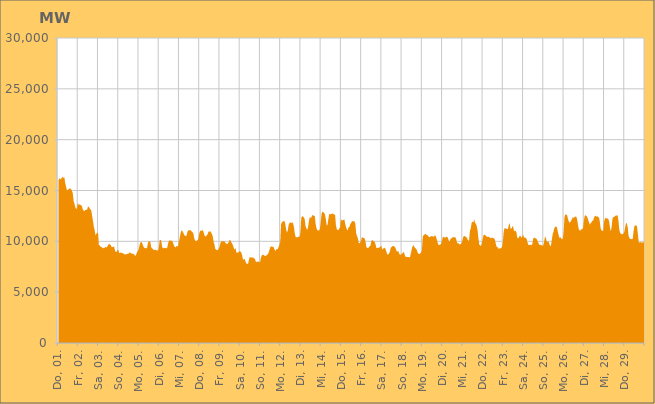
| Category | Series 0 |
|---|---|
|  Do, 01.  | 15973.024 |
|  Do, 01.  | 16181.244 |
|  Do, 01.  | 16151.253 |
|  Do, 01.  | 16112.939 |
|  Do, 01.  | 16266.176 |
|  Do, 01.  | 16353.806 |
|  Do, 01.  | 16229.027 |
|  Do, 01.  | 16307.304 |
|  Do, 01.  | 15726.67 |
|  Do, 01.  | 15411.526 |
|  Do, 01.  | 15055.984 |
|  Do, 01.  | 15001.579 |
|  Do, 01.  | 15139.679 |
|  Do, 01.  | 15179.922 |
|  Do, 01.  | 15215.665 |
|  Do, 01.  | 15140.846 |
|  Do, 01.  | 14971.231 |
|  Fr, 02.  | 14739.863 |
|  Fr, 02.  | 13972.299 |
|  Fr, 02.  | 13689.066 |
|  Fr, 02.  | 13361.912 |
|  Fr, 02.  | 13167.108 |
|  Fr, 02.  | 13268.631 |
|  Fr, 02.  | 13795.429 |
|  Fr, 02.  | 13591.06 |
|  Fr, 02.  | 13639.024 |
|  Fr, 02.  | 13594.183 |
|  Fr, 02.  | 13567.473 |
|  Fr, 02.  | 13409.868 |
|  Fr, 02.  | 13125.726 |
|  Fr, 02.  | 13001.564 |
|  Fr, 02.  | 12976.859 |
|  Fr, 02.  | 13080.528 |
|  Fr, 02.  | 13109.328 |
|  Fr, 02.  | 13105.562 |
|  Fr, 02.  | 13424.014 |
|  Fr, 02.  | 13401.077 |
|  Fr, 02.  | 13242.371 |
|  Fr, 02.  | 13151.693 |
|  Fr, 02.  | 13008.201 |
|  Fr, 02.  | 12475.806 |
|  Sa, 03.  | 12000.596 |
|  Sa, 03.  | 11430.194 |
|  Sa, 03.  | 11073.486 |
|  Sa, 03.  | 10582.131 |
|  Sa, 03.  | 10747.38 |
|  Sa, 03.  | 10856.532 |
|  Sa, 03.  | 10843.616 |
|  Sa, 03.  | 9610.03 |
|  Sa, 03.  | 9612.483 |
|  Sa, 03.  | 9476.751 |
|  Sa, 03.  | 9434.888 |
|  Sa, 03.  | 9360.974 |
|  Sa, 03.  | 9357.126 |
|  Sa, 03.  | 9306.625 |
|  Sa, 03.  | 9394.502 |
|  Sa, 03.  | 9457.1 |
|  Sa, 03.  | 9382.035 |
|  Sa, 03.  | 9501.917 |
|  Sa, 03.  | 9639.043 |
|  Sa, 03.  | 9762.879 |
|  Sa, 03.  | 9680.03 |
|  Sa, 03.  | 9643.187 |
|  Sa, 03.  | 9454.922 |
|  Sa, 03.  | 9428.805 |
|  So, 04.  | 9457.236 |
|  So, 04.  | 9495.153 |
|  So, 04.  | 9115.218 |
|  So, 04.  | 8938.82 |
|  So, 04.  | 8978.699 |
|  So, 04.  | 9135.456 |
|  So, 04.  | 9165.17 |
|  So, 04.  | 8843.097 |
|  So, 04.  | 8870.477 |
|  So, 04.  | 8892.076 |
|  So, 04.  | 8862.463 |
|  So, 04.  | 8864.319 |
|  So, 04.  | 8797.101 |
|  So, 04.  | 8730.633 |
|  So, 04.  | 8710.415 |
|  So, 04.  | 8751.233 |
|  So, 04.  | 8720.379 |
|  So, 04.  | 8785.919 |
|  So, 04.  | 8790.362 |
|  So, 04.  | 8881.627 |
|  So, 04.  | 8892.771 |
|  So, 04.  | 8824.985 |
|  So, 04.  | 8792.995 |
|  So, 04.  | 8774.985 |
|  Mo, 05.  | 8767.964 |
|  Mo, 05.  | 8681.777 |
|  Mo, 05.  | 8569.146 |
|  Mo, 05.  | 8632.191 |
|  Mo, 05.  | 8909.321 |
|  Mo, 05.  | 9032.205 |
|  Mo, 05.  | 9164.973 |
|  Mo, 05.  | 9527.968 |
|  Mo, 05.  | 9883.836 |
|  Mo, 05.  | 9926.851 |
|  Mo, 05.  | 9894.441 |
|  Mo, 05.  | 9660.539 |
|  Mo, 05.  | 9451.565 |
|  Mo, 05.  | 9369.037 |
|  Mo, 05.  | 9296.504 |
|  Mo, 05.  | 9349.753 |
|  Mo, 05.  | 9326.724 |
|  Mo, 05.  | 9764.883 |
|  Mo, 05.  | 10021.066 |
|  Mo, 05.  | 10010.311 |
|  Mo, 05.  | 9916.345 |
|  Mo, 05.  | 9427.824 |
|  Mo, 05.  | 9309.191 |
|  Mo, 05.  | 9244.052 |
|  Di, 06.  | 9142.913 |
|  Di, 06.  | 9183.791 |
|  Di, 06.  | 9181.81 |
|  Di, 06.  | 9133.861 |
|  Di, 06.  | 9094.754 |
|  Di, 06.  | 9093.314 |
|  Di, 06.  | 9355.79 |
|  Di, 06.  | 10075.642 |
|  Di, 06.  | 10158.158 |
|  Di, 06.  | 10036.177 |
|  Di, 06.  | 9459.117 |
|  Di, 06.  | 9312.2 |
|  Di, 06.  | 9324.291 |
|  Di, 06.  | 9361.728 |
|  Di, 06.  | 9343.222 |
|  Di, 06.  | 9308.455 |
|  Di, 06.  | 9367.006 |
|  Di, 06.  | 9776.653 |
|  Di, 06.  | 10054.021 |
|  Di, 06.  | 10089.498 |
|  Di, 06.  | 10068.217 |
|  Di, 06.  | 10064.181 |
|  Di, 06.  | 10060.848 |
|  Di, 06.  | 9814.581 |
|  Mi, 07.  | 9580.023 |
|  Mi, 07.  | 9466.96 |
|  Mi, 07.  | 9396.924 |
|  Mi, 07.  | 9548.819 |
|  Mi, 07.  | 9492.777 |
|  Mi, 07.  | 9540.759 |
|  Mi, 07.  | 10015.825 |
|  Mi, 07.  | 10433.23 |
|  Mi, 07.  | 10863.119 |
|  Mi, 07.  | 11075.724 |
|  Mi, 07.  | 11023.126 |
|  Mi, 07.  | 10860.678 |
|  Mi, 07.  | 10660.158 |
|  Mi, 07.  | 10536.947 |
|  Mi, 07.  | 10534.384 |
|  Mi, 07.  | 10564.515 |
|  Mi, 07.  | 10930.108 |
|  Mi, 07.  | 11082.345 |
|  Mi, 07.  | 11092.18 |
|  Mi, 07.  | 11103.236 |
|  Mi, 07.  | 11075.138 |
|  Mi, 07.  | 10965.102 |
|  Mi, 07.  | 10897.066 |
|  Mi, 07.  | 10781.215 |
|  Do, 08.  | 10314.994 |
|  Do, 08.  | 10088.684 |
|  Do, 08.  | 10023.937 |
|  Do, 08.  | 10042.881 |
|  Do, 08.  | 10115.078 |
|  Do, 08.  | 10249.32 |
|  Do, 08.  | 10787.255 |
|  Do, 08.  | 11009.731 |
|  Do, 08.  | 11061.217 |
|  Do, 08.  | 11023.871 |
|  Do, 08.  | 11116.862 |
|  Do, 08.  | 10955.682 |
|  Do, 08.  | 10633.098 |
|  Do, 08.  | 10464.734 |
|  Do, 08.  | 10517.703 |
|  Do, 08.  | 10597.197 |
|  Do, 08.  | 10716.789 |
|  Do, 08.  | 10979.657 |
|  Do, 08.  | 10956.759 |
|  Do, 08.  | 10995.235 |
|  Do, 08.  | 10868.739 |
|  Do, 08.  | 10702.028 |
|  Do, 08.  | 10491.965 |
|  Do, 08.  | 9958.967 |
|  Fr, 09.  | 9689.092 |
|  Fr, 09.  | 9230.106 |
|  Fr, 09.  | 9205.088 |
|  Fr, 09.  | 9124.329 |
|  Fr, 09.  | 9153.877 |
|  Fr, 09.  | 9268.685 |
|  Fr, 09.  | 9473.546 |
|  Fr, 09.  | 9814.813 |
|  Fr, 09.  | 10020.173 |
|  Fr, 09.  | 9973.335 |
|  Fr, 09.  | 10024.211 |
|  Fr, 09.  | 10008.517 |
|  Fr, 09.  | 9999.473 |
|  Fr, 09.  | 9831.953 |
|  Fr, 09.  | 9783.682 |
|  Fr, 09.  | 9718.68 |
|  Fr, 09.  | 9811.833 |
|  Fr, 09.  | 9927.707 |
|  Fr, 09.  | 10144.272 |
|  Fr, 09.  | 10089.063 |
|  Fr, 09.  | 9892.266 |
|  Fr, 09.  | 9777.616 |
|  Fr, 09.  | 9575.658 |
|  Fr, 09.  | 9330.206 |
|  Sa, 10.  | 9176.049 |
|  Sa, 10.  | 9342.849 |
|  Sa, 10.  | 8905.164 |
|  Sa, 10.  | 8883.748 |
|  Sa, 10.  | 8898.603 |
|  Sa, 10.  | 8945.141 |
|  Sa, 10.  | 9072.009 |
|  Sa, 10.  | 8986.767 |
|  Sa, 10.  | 8860.562 |
|  Sa, 10.  | 8565.263 |
|  Sa, 10.  | 8151.544 |
|  Sa, 10.  | 8301.929 |
|  Sa, 10.  | 8218.749 |
|  Sa, 10.  | 7970.765 |
|  Sa, 10.  | 7798.356 |
|  Sa, 10.  | 7778.507 |
|  Sa, 10.  | 7816.417 |
|  Sa, 10.  | 8251.659 |
|  Sa, 10.  | 8480.732 |
|  Sa, 10.  | 8398.217 |
|  Sa, 10.  | 8403.713 |
|  Sa, 10.  | 8401.515 |
|  Sa, 10.  | 8406.379 |
|  Sa, 10.  | 8320.421 |
|  So, 11.  | 8273.512 |
|  So, 11.  | 8004.156 |
|  So, 11.  | 7954.755 |
|  So, 11.  | 8014.545 |
|  So, 11.  | 8008.324 |
|  So, 11.  | 7970.659 |
|  So, 11.  | 7903.126 |
|  So, 11.  | 8350.441 |
|  So, 11.  | 8604.19 |
|  So, 11.  | 8676.769 |
|  So, 11.  | 8677.67 |
|  So, 11.  | 8599.654 |
|  So, 11.  | 8581.068 |
|  So, 11.  | 8557.444 |
|  So, 11.  | 8644.376 |
|  So, 11.  | 8713.016 |
|  So, 11.  | 8845.236 |
|  So, 11.  | 9102.453 |
|  So, 11.  | 9382.582 |
|  So, 11.  | 9512.894 |
|  So, 11.  | 9476.768 |
|  So, 11.  | 9459.488 |
|  So, 11.  | 9455.46 |
|  So, 11.  | 9262.176 |
|  Mo, 12.  | 9030.014 |
|  Mo, 12.  | 9159.121 |
|  Mo, 12.  | 9266.093 |
|  Mo, 12.  | 9220.098 |
|  Mo, 12.  | 9427.814 |
|  Mo, 12.  | 9652.057 |
|  Mo, 12.  | 9911.663 |
|  Mo, 12.  | 11668.728 |
|  Mo, 12.  | 11894.321 |
|  Mo, 12.  | 11942.183 |
|  Mo, 12.  | 11987.23 |
|  Mo, 12.  | 12023.788 |
|  Mo, 12.  | 11706.176 |
|  Mo, 12.  | 11168.44 |
|  Mo, 12.  | 10857.049 |
|  Mo, 12.  | 11079.002 |
|  Mo, 12.  | 11638.923 |
|  Mo, 12.  | 11813.154 |
|  Mo, 12.  | 11873.482 |
|  Mo, 12.  | 11774.899 |
|  Mo, 12.  | 11886.039 |
|  Mo, 12.  | 11810.452 |
|  Mo, 12.  | 11515.705 |
|  Mo, 12.  | 10919.132 |
|  Di, 13.  | 10469.542 |
|  Di, 13.  | 10403.993 |
|  Di, 13.  | 10376.415 |
|  Di, 13.  | 10423.491 |
|  Di, 13.  | 10469.572 |
|  Di, 13.  | 10446.579 |
|  Di, 13.  | 10890.596 |
|  Di, 13.  | 12330.932 |
|  Di, 13.  | 12457.253 |
|  Di, 13.  | 12457.689 |
|  Di, 13.  | 12337.197 |
|  Di, 13.  | 12171.311 |
|  Di, 13.  | 11473.841 |
|  Di, 13.  | 11292.293 |
|  Di, 13.  | 11116.578 |
|  Di, 13.  | 11393.908 |
|  Di, 13.  | 11974.636 |
|  Di, 13.  | 12364.924 |
|  Di, 13.  | 12323.623 |
|  Di, 13.  | 12338.389 |
|  Di, 13.  | 12610.248 |
|  Di, 13.  | 12528.577 |
|  Di, 13.  | 12531.767 |
|  Di, 13.  | 12467.813 |
|  Mi, 14.  | 11683.941 |
|  Mi, 14.  | 11279.728 |
|  Mi, 14.  | 11104.703 |
|  Mi, 14.  | 11054.159 |
|  Mi, 14.  | 11054.23 |
|  Mi, 14.  | 11220.415 |
|  Mi, 14.  | 11824.108 |
|  Mi, 14.  | 12694.798 |
|  Mi, 14.  | 12929.112 |
|  Mi, 14.  | 12883.93 |
|  Mi, 14.  | 12799.453 |
|  Mi, 14.  | 12647.461 |
|  Mi, 14.  | 12229.811 |
|  Mi, 14.  | 11587.991 |
|  Mi, 14.  | 11568.27 |
|  Mi, 14.  | 12146.696 |
|  Mi, 14.  | 12688.925 |
|  Mi, 14.  | 12648.613 |
|  Mi, 14.  | 12667.685 |
|  Mi, 14.  | 12698.082 |
|  Mi, 14.  | 12752.541 |
|  Mi, 14.  | 12691.413 |
|  Mi, 14.  | 12585.264 |
|  Mi, 14.  | 12675.773 |
|  Do, 15.  | 11610.48 |
|  Do, 15.  | 11213.917 |
|  Do, 15.  | 11109.108 |
|  Do, 15.  | 11107.578 |
|  Do, 15.  | 11250.657 |
|  Do, 15.  | 11399.511 |
|  Do, 15.  | 12183.882 |
|  Do, 15.  | 12043.481 |
|  Do, 15.  | 12061.752 |
|  Do, 15.  | 12109.594 |
|  Do, 15.  | 12174.901 |
|  Do, 15.  | 11734.718 |
|  Do, 15.  | 11414.8 |
|  Do, 15.  | 11163.501 |
|  Do, 15.  | 11089.163 |
|  Do, 15.  | 11376.942 |
|  Do, 15.  | 11413.669 |
|  Do, 15.  | 11698.868 |
|  Do, 15.  | 11794.451 |
|  Do, 15.  | 11977.651 |
|  Do, 15.  | 11989.48 |
|  Do, 15.  | 11983.626 |
|  Do, 15.  | 11960.04 |
|  Do, 15.  | 11762.329 |
|  Fr, 16.  | 10817.773 |
|  Fr, 16.  | 10519.803 |
|  Fr, 16.  | 10318.989 |
|  Fr, 16.  | 9855.678 |
|  Fr, 16.  | 9798.03 |
|  Fr, 16.  | 9897.362 |
|  Fr, 16.  | 10116.542 |
|  Fr, 16.  | 10440.666 |
|  Fr, 16.  | 10348.851 |
|  Fr, 16.  | 10323.621 |
|  Fr, 16.  | 10292.307 |
|  Fr, 16.  | 10055.845 |
|  Fr, 16.  | 9462.713 |
|  Fr, 16.  | 9337.773 |
|  Fr, 16.  | 9381.388 |
|  Fr, 16.  | 9371.848 |
|  Fr, 16.  | 9543.293 |
|  Fr, 16.  | 9571.315 |
|  Fr, 16.  | 10015.126 |
|  Fr, 16.  | 10131.618 |
|  Fr, 16.  | 10071.005 |
|  Fr, 16.  | 9989.889 |
|  Fr, 16.  | 9960.476 |
|  Fr, 16.  | 9699.079 |
|  Sa, 17.  | 9342.598 |
|  Sa, 17.  | 9337.947 |
|  Sa, 17.  | 9393.332 |
|  Sa, 17.  | 9351.278 |
|  Sa, 17.  | 9440.294 |
|  Sa, 17.  | 9482.627 |
|  Sa, 17.  | 9568.581 |
|  Sa, 17.  | 9159.585 |
|  Sa, 17.  | 9301.907 |
|  Sa, 17.  | 9313.529 |
|  Sa, 17.  | 9377.492 |
|  Sa, 17.  | 9203.81 |
|  Sa, 17.  | 8923.941 |
|  Sa, 17.  | 8705.231 |
|  Sa, 17.  | 8697.529 |
|  Sa, 17.  | 8818.975 |
|  Sa, 17.  | 8968.874 |
|  Sa, 17.  | 9348.742 |
|  Sa, 17.  | 9443.505 |
|  Sa, 17.  | 9526.738 |
|  Sa, 17.  | 9541.513 |
|  Sa, 17.  | 9516.994 |
|  Sa, 17.  | 9449.47 |
|  Sa, 17.  | 9272.107 |
|  So, 18.  | 9031.391 |
|  So, 18.  | 8995.266 |
|  So, 18.  | 9050.035 |
|  So, 18.  | 8798.561 |
|  So, 18.  | 8693.425 |
|  So, 18.  | 8662.762 |
|  So, 18.  | 8815.595 |
|  So, 18.  | 8807.045 |
|  So, 18.  | 8961.202 |
|  So, 18.  | 8857.295 |
|  So, 18.  | 8530.805 |
|  So, 18.  | 8474.173 |
|  So, 18.  | 8472.151 |
|  So, 18.  | 8455.039 |
|  So, 18.  | 8461.75 |
|  So, 18.  | 8418.966 |
|  So, 18.  | 8479.166 |
|  So, 18.  | 8858.909 |
|  So, 18.  | 9257.33 |
|  So, 18.  | 9529.225 |
|  So, 18.  | 9618.666 |
|  So, 18.  | 9441.081 |
|  So, 18.  | 9347.083 |
|  So, 18.  | 9270.478 |
|  Mo, 19.  | 9131.658 |
|  Mo, 19.  | 8885.885 |
|  Mo, 19.  | 8778.656 |
|  Mo, 19.  | 8743.436 |
|  Mo, 19.  | 8816.807 |
|  Mo, 19.  | 8900.742 |
|  Mo, 19.  | 9136.757 |
|  Mo, 19.  | 10469.239 |
|  Mo, 19.  | 10608.203 |
|  Mo, 19.  | 10654.754 |
|  Mo, 19.  | 10747.136 |
|  Mo, 19.  | 10670.959 |
|  Mo, 19.  | 10611.185 |
|  Mo, 19.  | 10584.189 |
|  Mo, 19.  | 10472.267 |
|  Mo, 19.  | 10398.528 |
|  Mo, 19.  | 10482.653 |
|  Mo, 19.  | 10488.252 |
|  Mo, 19.  | 10519.31 |
|  Mo, 19.  | 10485.415 |
|  Mo, 19.  | 10432.039 |
|  Mo, 19.  | 10553.07 |
|  Mo, 19.  | 10584.705 |
|  Mo, 19.  | 10330.494 |
|  Di, 20.  | 10081.549 |
|  Di, 20.  | 9776.928 |
|  Di, 20.  | 9614.602 |
|  Di, 20.  | 9654.39 |
|  Di, 20.  | 9687.991 |
|  Di, 20.  | 9809.755 |
|  Di, 20.  | 10132.192 |
|  Di, 20.  | 10471.27 |
|  Di, 20.  | 10409.379 |
|  Di, 20.  | 10376.67 |
|  Di, 20.  | 10384.324 |
|  Di, 20.  | 10438.777 |
|  Di, 20.  | 10440.845 |
|  Di, 20.  | 10289.236 |
|  Di, 20.  | 10044.44 |
|  Di, 20.  | 9994.319 |
|  Di, 20.  | 10263.269 |
|  Di, 20.  | 10287.111 |
|  Di, 20.  | 10378.999 |
|  Di, 20.  | 10421.748 |
|  Di, 20.  | 10389.095 |
|  Di, 20.  | 10398.779 |
|  Di, 20.  | 10368.282 |
|  Di, 20.  | 10066.974 |
|  Mi, 21.  | 9795.28 |
|  Mi, 21.  | 9842.172 |
|  Mi, 21.  | 9734.205 |
|  Mi, 21.  | 9694.612 |
|  Mi, 21.  | 9718.805 |
|  Mi, 21.  | 9844.373 |
|  Mi, 21.  | 10098.027 |
|  Mi, 21.  | 10438.705 |
|  Mi, 21.  | 10525.852 |
|  Mi, 21.  | 10505.368 |
|  Mi, 21.  | 10429.9 |
|  Mi, 21.  | 10386.941 |
|  Mi, 21.  | 10235.352 |
|  Mi, 21.  | 10013.295 |
|  Mi, 21.  | 10195.869 |
|  Mi, 21.  | 11074.27 |
|  Mi, 21.  | 11295.89 |
|  Mi, 21.  | 11827.543 |
|  Mi, 21.  | 11947.403 |
|  Mi, 21.  | 11854.491 |
|  Mi, 21.  | 12186.461 |
|  Mi, 21.  | 11815.6 |
|  Mi, 21.  | 11719.587 |
|  Mi, 21.  | 11514.445 |
|  Do, 22.  | 11068.825 |
|  Do, 22.  | 10267.707 |
|  Do, 22.  | 9652.526 |
|  Do, 22.  | 9619.286 |
|  Do, 22.  | 9538.811 |
|  Do, 22.  | 9766.007 |
|  Do, 22.  | 10213.677 |
|  Do, 22.  | 10613.31 |
|  Do, 22.  | 10650.986 |
|  Do, 22.  | 10609.174 |
|  Do, 22.  | 10532.959 |
|  Do, 22.  | 10457.146 |
|  Do, 22.  | 10446.591 |
|  Do, 22.  | 10442.953 |
|  Do, 22.  | 10428.53 |
|  Do, 22.  | 10303.632 |
|  Do, 22.  | 10344.861 |
|  Do, 22.  | 10333.708 |
|  Do, 22.  | 10371.163 |
|  Do, 22.  | 10296.328 |
|  Do, 22.  | 10273.032 |
|  Do, 22.  | 9987.445 |
|  Do, 22.  | 9607.914 |
|  Do, 22.  | 9408.238 |
|  Fr, 23.  | 9432.475 |
|  Fr, 23.  | 9242.73 |
|  Fr, 23.  | 9299.891 |
|  Fr, 23.  | 9330.914 |
|  Fr, 23.  | 9316.281 |
|  Fr, 23.  | 9459.367 |
|  Fr, 23.  | 9944.538 |
|  Fr, 23.  | 11000.626 |
|  Fr, 23.  | 11298.051 |
|  Fr, 23.  | 11275.843 |
|  Fr, 23.  | 11235.32 |
|  Fr, 23.  | 11219.225 |
|  Fr, 23.  | 11222.853 |
|  Fr, 23.  | 11597.591 |
|  Fr, 23.  | 11778.408 |
|  Fr, 23.  | 11258.883 |
|  Fr, 23.  | 11230.616 |
|  Fr, 23.  | 11400.169 |
|  Fr, 23.  | 11522.644 |
|  Fr, 23.  | 11086.216 |
|  Fr, 23.  | 10962.118 |
|  Fr, 23.  | 11065.121 |
|  Fr, 23.  | 10893.413 |
|  Fr, 23.  | 10365.827 |
|  Sa, 24.  | 10288.564 |
|  Sa, 24.  | 10374.399 |
|  Sa, 24.  | 10558.092 |
|  Sa, 24.  | 10515.514 |
|  Sa, 24.  | 10335.396 |
|  Sa, 24.  | 10487.327 |
|  Sa, 24.  | 10663.238 |
|  Sa, 24.  | 10388.321 |
|  Sa, 24.  | 10361.91 |
|  Sa, 24.  | 10339.879 |
|  Sa, 24.  | 10269.735 |
|  Sa, 24.  | 9952.993 |
|  Sa, 24.  | 9674.545 |
|  Sa, 24.  | 9640.229 |
|  Sa, 24.  | 9635.842 |
|  Sa, 24.  | 9672.011 |
|  Sa, 24.  | 9603.05 |
|  Sa, 24.  | 9758.613 |
|  Sa, 24.  | 10289.149 |
|  Sa, 24.  | 10357.362 |
|  Sa, 24.  | 10346.895 |
|  Sa, 24.  | 10254.91 |
|  Sa, 24.  | 10246.146 |
|  Sa, 24.  | 10063.585 |
|  So, 25.  | 9870.402 |
|  So, 25.  | 9658.877 |
|  So, 25.  | 9667.434 |
|  So, 25.  | 9652.794 |
|  So, 25.  | 9603.383 |
|  So, 25.  | 9556.117 |
|  So, 25.  | 9621.679 |
|  So, 25.  | 10014.407 |
|  So, 25.  | 10480.579 |
|  So, 25.  | 10319.782 |
|  So, 25.  | 9991.626 |
|  So, 25.  | 9932.512 |
|  So, 25.  | 10009.49 |
|  So, 25.  | 9768.541 |
|  So, 25.  | 9540.526 |
|  So, 25.  | 9563.712 |
|  So, 25.  | 10135.182 |
|  So, 25.  | 10690.962 |
|  So, 25.  | 10944.658 |
|  So, 25.  | 11287.787 |
|  So, 25.  | 11428.74 |
|  So, 25.  | 11452.068 |
|  So, 25.  | 11381.975 |
|  So, 25.  | 11001.535 |
|  Mo, 26.  | 10641.585 |
|  Mo, 26.  | 10328.029 |
|  Mo, 26.  | 10420.69 |
|  Mo, 26.  | 10313.688 |
|  Mo, 26.  | 10197.62 |
|  Mo, 26.  | 10254.419 |
|  Mo, 26.  | 10897.495 |
|  Mo, 26.  | 12349.587 |
|  Mo, 26.  | 12678.604 |
|  Mo, 26.  | 12594.055 |
|  Mo, 26.  | 12627.819 |
|  Mo, 26.  | 12262.195 |
|  Mo, 26.  | 11986.391 |
|  Mo, 26.  | 11825.905 |
|  Mo, 26.  | 11904.193 |
|  Mo, 26.  | 12058.911 |
|  Mo, 26.  | 12182.828 |
|  Mo, 26.  | 12409.41 |
|  Mo, 26.  | 12283.575 |
|  Mo, 26.  | 12390.959 |
|  Mo, 26.  | 12432.05 |
|  Mo, 26.  | 12438.715 |
|  Mo, 26.  | 12163.103 |
|  Mo, 26.  | 11618.305 |
|  Di, 27.  | 11179.277 |
|  Di, 27.  | 11056.99 |
|  Di, 27.  | 11071.289 |
|  Di, 27.  | 11192.927 |
|  Di, 27.  | 11191.439 |
|  Di, 27.  | 11287.754 |
|  Di, 27.  | 11985.372 |
|  Di, 27.  | 12512.519 |
|  Di, 27.  | 12577.001 |
|  Di, 27.  | 12494.406 |
|  Di, 27.  | 12395.482 |
|  Di, 27.  | 12150.195 |
|  Di, 27.  | 11898.648 |
|  Di, 27.  | 11642.075 |
|  Di, 27.  | 11779.408 |
|  Di, 27.  | 11862.651 |
|  Di, 27.  | 12011.209 |
|  Di, 27.  | 12053.796 |
|  Di, 27.  | 12312.042 |
|  Di, 27.  | 12475.619 |
|  Di, 27.  | 12529.794 |
|  Di, 27.  | 12414.12 |
|  Di, 27.  | 12482.905 |
|  Di, 27.  | 12369.049 |
|  Mi, 28.  | 12368.809 |
|  Mi, 28.  | 11876.817 |
|  Mi, 28.  | 11233.354 |
|  Mi, 28.  | 11080.962 |
|  Mi, 28.  | 11019.359 |
|  Mi, 28.  | 11020.281 |
|  Mi, 28.  | 11947.521 |
|  Mi, 28.  | 12217.941 |
|  Mi, 28.  | 12336.298 |
|  Mi, 28.  | 12252.802 |
|  Mi, 28.  | 12251.252 |
|  Mi, 28.  | 12186.237 |
|  Mi, 28.  | 11947.673 |
|  Mi, 28.  | 11327.101 |
|  Mi, 28.  | 10983.691 |
|  Mi, 28.  | 11464.753 |
|  Mi, 28.  | 12260.781 |
|  Mi, 28.  | 12374.371 |
|  Mi, 28.  | 12409.296 |
|  Mi, 28.  | 12482.319 |
|  Mi, 28.  | 12550.254 |
|  Mi, 28.  | 12529.897 |
|  Mi, 28.  | 12579.329 |
|  Mi, 28.  | 12037.205 |
|  Do, 29.  | 11152.652 |
|  Do, 29.  | 10835.122 |
|  Do, 29.  | 10740.443 |
|  Do, 29.  | 10705.526 |
|  Do, 29.  | 10689.476 |
|  Do, 29.  | 10768.859 |
|  Do, 29.  | 10946.405 |
|  Do, 29.  | 11379.22 |
|  Do, 29.  | 11772.301 |
|  Do, 29.  | 11777.39 |
|  Do, 29.  | 11379.553 |
|  Do, 29.  | 10554.536 |
|  Do, 29.  | 10323.608 |
|  Do, 29.  | 10225.709 |
|  Do, 29.  | 10258.212 |
|  Do, 29.  | 10180.043 |
|  Do, 29.  | 10279.814 |
|  Do, 29.  | 11008.722 |
|  Do, 29.  | 11526.584 |
|  Do, 29.  | 11566.37 |
|  Do, 29.  | 11563.224 |
|  Do, 29.  | 11488.387 |
|  Do, 29.  | 10752.442 |
|  Do, 29.  | 9930.369 |
|  Fr, 01.  | 9870.987 |
|  Fr, 01.  | 9928.594 |
|  Fr, 01.  | 9884.164 |
|  Fr, 01.  | 9889.059 |
|  Fr, 01.  | 9875.487 |
|  Fr, 01.  | 9924.875 |
|    | 10170.904 |